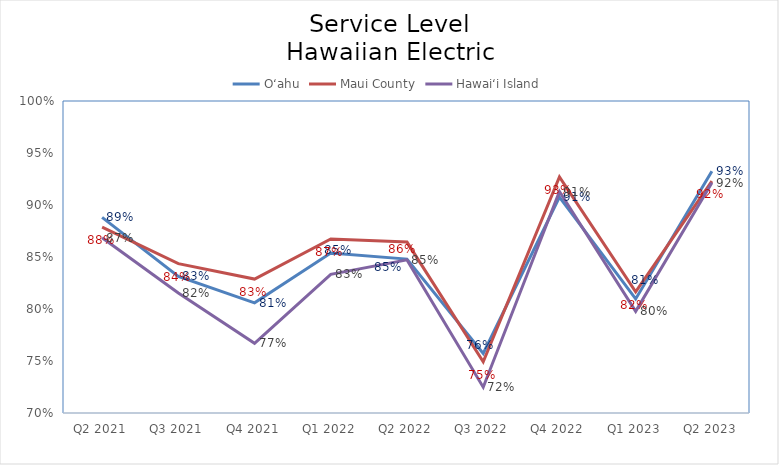
| Category | O‘ahu | Maui County | Hawai‘i Island |
|---|---|---|---|
| Q2 2021 | 0.888 | 0.879 | 0.869 |
| Q3 2021 | 0.831 | 0.844 | 0.815 |
| Q4 2021 | 0.806 | 0.829 | 0.767 |
| Q1 2022 | 0.854 | 0.867 | 0.833 |
| Q2 2022 | 0.848 | 0.864 | 0.847 |
| Q3 2022 | 0.757 | 0.749 | 0.725 |
| Q4 2022 | 0.908 | 0.927 | 0.913 |
| Q1 2023 | 0.81 | 0.817 | 0.798 |
| Q2 2023 | 0.933 | 0.923 | 0.921 |